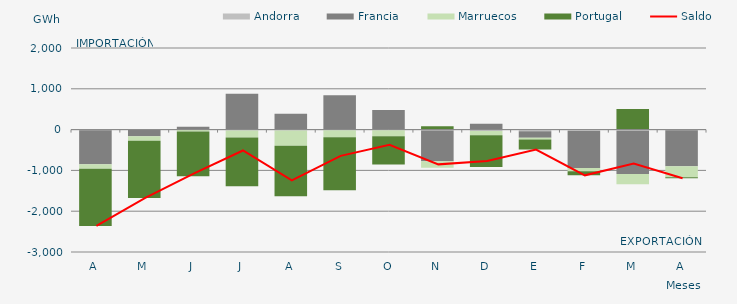
| Category | Andorra | Francia | Marruecos | Portugal |
|---|---|---|---|---|
| A | -14.627 | -836.505 | -105.478 | -1404.431 |
| M | -10.909 | -149.423 | -115.706 | -1398.852 |
| J | -2.08 | 70.4 | -42.701 | -1096.73 |
| J | -19.231 | 877.054 | -174.716 | -1194.709 |
| A | -19.938 | 386.697 | -376.794 | -1234.348 |
| S | -15.222 | 839.394 | -170.976 | -1297.757 |
| O | -13.493 | 479.877 | -148.522 | -692.604 |
| N | -23.834 | -750.519 | -162.286 | 84.596 |
| D | -34.648 | 145.337 | -106.176 | -774.498 |
| E | -40.623 | -161.618 | -38.221 | -248.586 |
| F | -34.3 | -904.751 | -79.926 | -101.643 |
| M | -27.324 | -1059.175 | -252.596 | 506.03 |
| A | -13.533 | -885.101 | -267.757 | -24.519 |